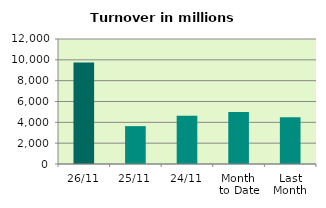
| Category | Series 0 |
|---|---|
| 26/11 | 9752.687 |
| 25/11 | 3636.239 |
| 24/11 | 4627.156 |
| Month 
to Date | 4982.372 |
| Last
Month | 4491.272 |